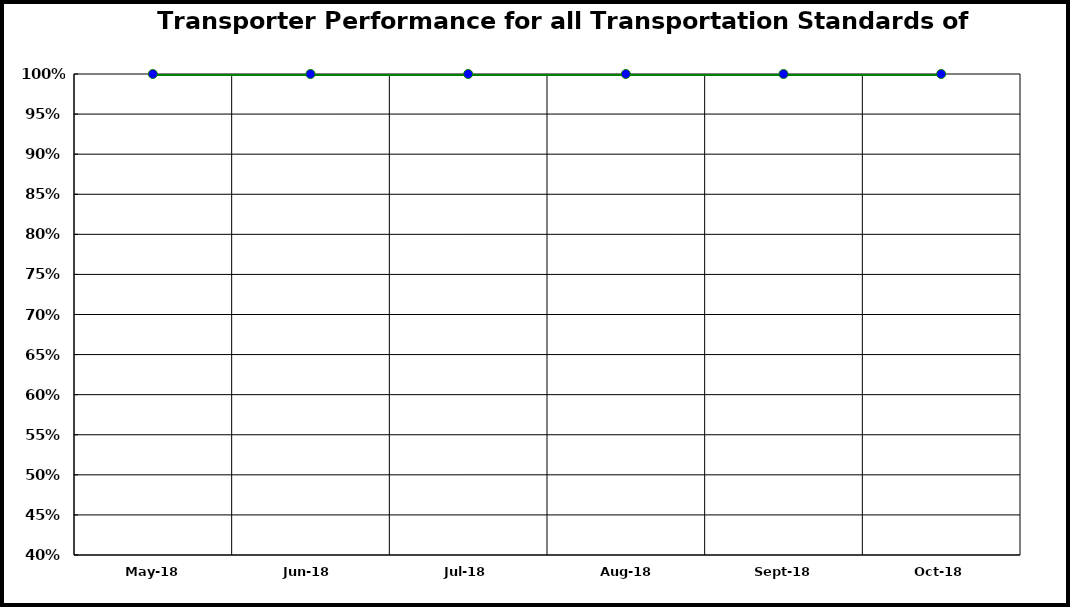
| Category | Performance |
|---|---|
| 2018-05-01 | 1 |
| 2018-06-01 | 1 |
| 2018-07-01 | 1 |
| 2018-08-01 | 1 |
| 2018-09-01 | 1 |
| 2018-10-01 | 1 |